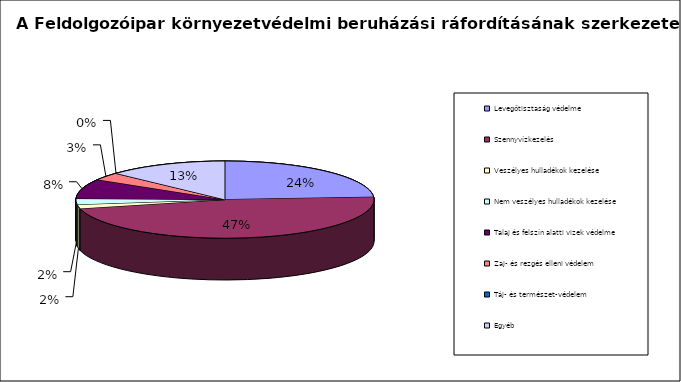
| Category | Series 0 |
|---|---|
| Levegőtisztaság védelme | 5470.52 |
| Szennyvízkezelés | 10788.406 |
| Veszélyes hulladékok kezelése | 391.261 |
| Nem veszélyes hulladékok kezelése | 560.233 |
| Talaj és felszín alatti vizek védelme | 1875.033 |
| Zaj- és rezgés elleni védelem | 729.581 |
| Táj- és természet-védelem | 31.236 |
| Egyéb | 2964.557 |